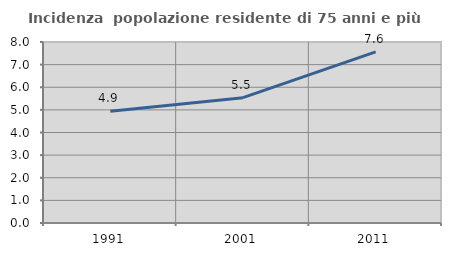
| Category | Incidenza  popolazione residente di 75 anni e più |
|---|---|
| 1991.0 | 4.943 |
| 2001.0 | 5.541 |
| 2011.0 | 7.564 |